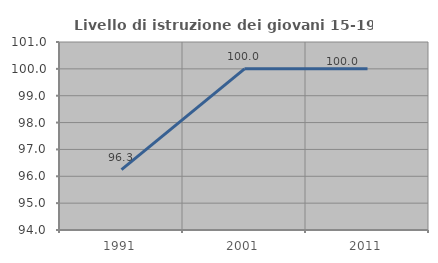
| Category | Livello di istruzione dei giovani 15-19 anni |
|---|---|
| 1991.0 | 96.25 |
| 2001.0 | 100 |
| 2011.0 | 100 |